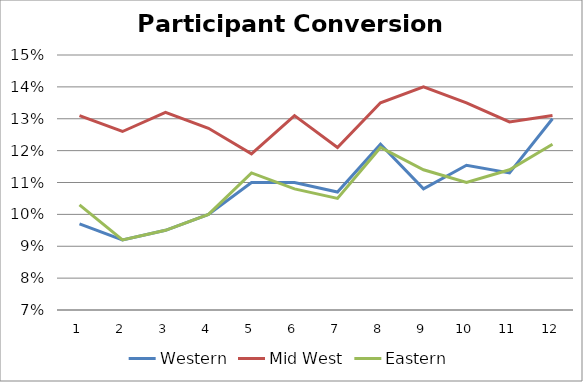
| Category | Western | Mid West | Eastern |
|---|---|---|---|
| 0 | 0.097 | 0.131 | 0.103 |
| 1 | 0.092 | 0.126 | 0.092 |
| 2 | 0.095 | 0.132 | 0.095 |
| 3 | 0.1 | 0.127 | 0.1 |
| 4 | 0.11 | 0.119 | 0.113 |
| 5 | 0.11 | 0.131 | 0.108 |
| 6 | 0.107 | 0.121 | 0.105 |
| 7 | 0.122 | 0.135 | 0.121 |
| 8 | 0.108 | 0.14 | 0.114 |
| 9 | 0.115 | 0.135 | 0.11 |
| 10 | 0.113 | 0.129 | 0.114 |
| 11 | 0.13 | 0.131 | 0.122 |